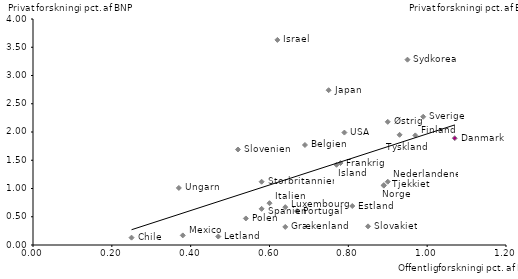
| Category | Privat forskning i pct. af BNP |
|---|---|
| 0.62 | 3.63 |
| 0.95 | 3.28 |
| 0.75 | 2.74 |
| 0.99 | 2.27 |
| 0.9 | 2.18 |
| 0.79 | 1.99 |
| 0.93 | 1.95 |
| 0.97 | 1.94 |
| 1.07 | 1.89 |
| 0.69 | 1.77 |
| 0.52 | 1.69 |
| 0.78 | 1.45 |
| 0.77 | 1.42 |
| 0.9 | 1.12 |
| 0.58 | 1.12 |
| 0.89 | 1.06 |
| 0.89 | 1.05 |
| 0.37 | 1.01 |
| 0.6 | 0.74 |
| 0.81 | 0.69 |
| 0.64 | 0.67 |
| 0.58 | 0.64 |
| 0.67 | 0.6 |
| 0.54 | 0.47 |
| 0.85 | 0.33 |
| 0.64 | 0.32 |
| 0.38 | 0.17 |
| 0.47 | 0.15 |
| 0.25 | 0.13 |